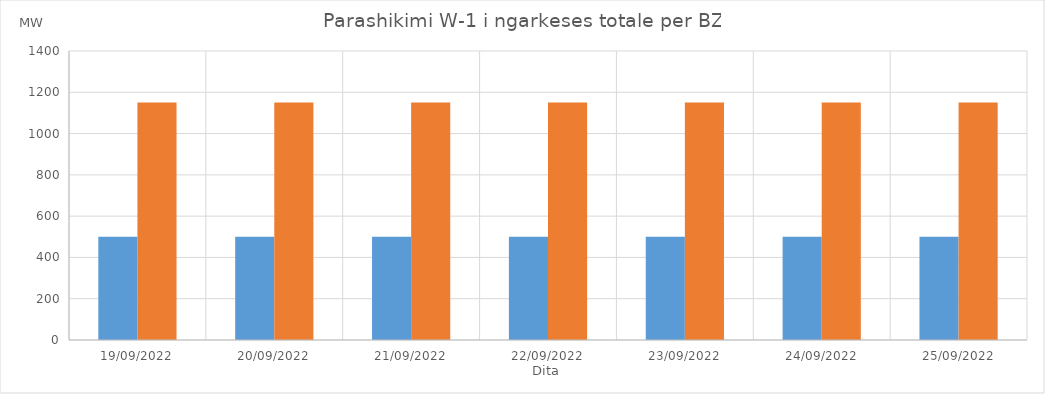
| Category | Min (MW) | Max (MW) |
|---|---|---|
| 19/09/2022 | 500 | 1150 |
| 20/09/2022 | 500 | 1150 |
| 21/09/2022 | 500 | 1150 |
| 22/09/2022 | 500 | 1150 |
| 23/09/2022 | 500 | 1150 |
| 24/09/2022 | 500 | 1150 |
| 25/09/2022 | 500 | 1150 |